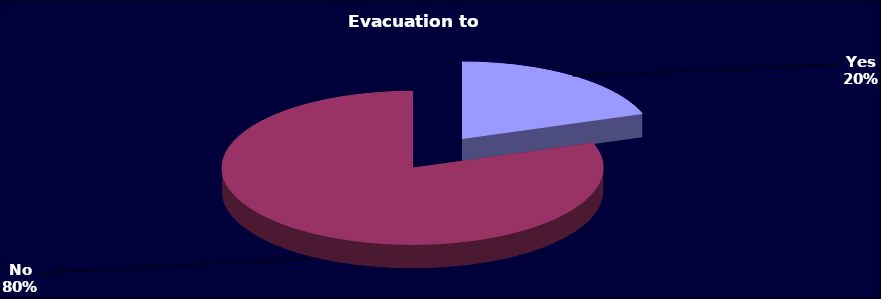
| Category | Series 0 |
|---|---|
| Yes | 134 |
| No | 546 |